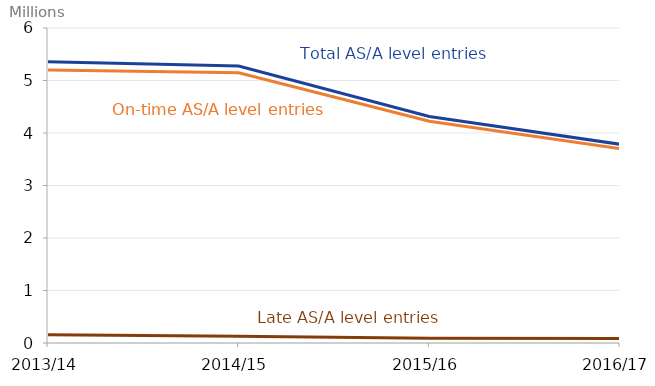
| Category | Total Entries | On-time entries | Late entries |
|---|---|---|---|
| 2013/14 | 5355495 | 5199430 | 156065 |
| 2014/15 | 5275425 | 5148675 | 126745 |
| 2015/16 | 4315290 | 4224440 | 90845 |
| 2016/17 | 3785275 | 3701300 | 83975 |